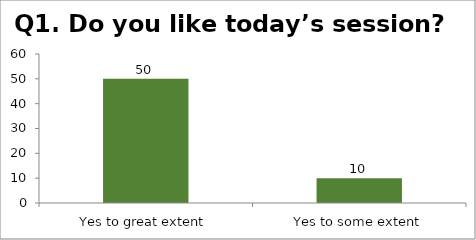
| Category | Q1. Do you like today’s session? |
|---|---|
| Yes to great extent | 50 |
| Yes to some extent | 10 |